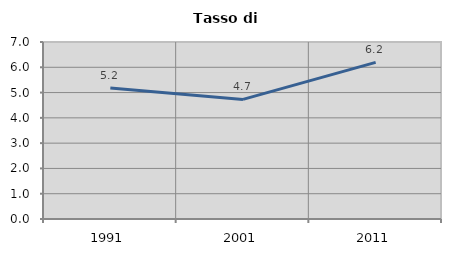
| Category | Tasso di disoccupazione   |
|---|---|
| 1991.0 | 5.181 |
| 2001.0 | 4.73 |
| 2011.0 | 6.195 |